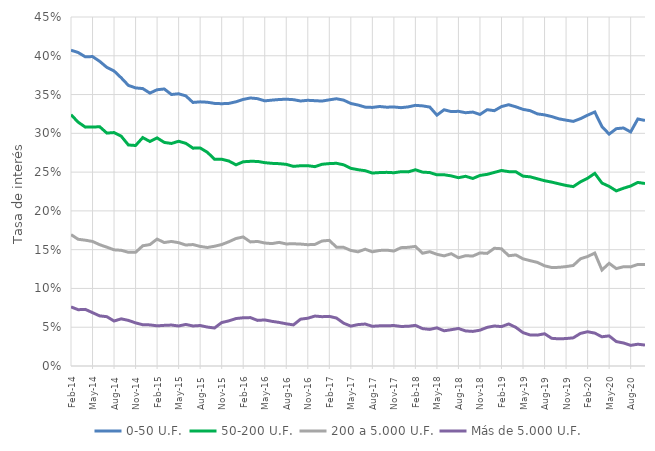
| Category | 0-50 U.F. | 50-200 U.F. | 200 a 5.000 U.F. | Más de 5.000 U.F. |
|---|---|---|---|---|
| 2014-02-01 | 0.407 | 0.324 | 0.169 | 0.076 |
| 2014-03-01 | 0.404 | 0.314 | 0.163 | 0.073 |
| 2014-04-01 | 0.399 | 0.308 | 0.162 | 0.073 |
| 2014-05-01 | 0.399 | 0.308 | 0.161 | 0.069 |
| 2014-06-01 | 0.393 | 0.308 | 0.156 | 0.065 |
| 2014-07-01 | 0.385 | 0.3 | 0.153 | 0.064 |
| 2014-08-01 | 0.38 | 0.301 | 0.15 | 0.058 |
| 2014-09-01 | 0.372 | 0.296 | 0.149 | 0.061 |
| 2014-10-01 | 0.362 | 0.285 | 0.147 | 0.059 |
| 2014-11-01 | 0.359 | 0.284 | 0.147 | 0.056 |
| 2014-12-01 | 0.358 | 0.294 | 0.155 | 0.053 |
| 2015-01-01 | 0.352 | 0.29 | 0.157 | 0.053 |
| 2015-02-01 | 0.356 | 0.294 | 0.164 | 0.052 |
| 2015-03-01 | 0.357 | 0.288 | 0.159 | 0.052 |
| 2015-04-01 | 0.35 | 0.287 | 0.161 | 0.053 |
| 2015-05-01 | 0.351 | 0.29 | 0.159 | 0.052 |
| 2015-06-01 | 0.348 | 0.287 | 0.156 | 0.054 |
| 2015-07-01 | 0.34 | 0.281 | 0.157 | 0.052 |
| 2015-08-01 | 0.341 | 0.281 | 0.154 | 0.052 |
| 2015-09-01 | 0.34 | 0.276 | 0.153 | 0.05 |
| 2015-10-01 | 0.339 | 0.267 | 0.154 | 0.049 |
| 2015-11-01 | 0.338 | 0.267 | 0.157 | 0.056 |
| 2015-12-01 | 0.339 | 0.264 | 0.16 | 0.058 |
| 2016-01-01 | 0.341 | 0.259 | 0.164 | 0.061 |
| 2016-02-01 | 0.344 | 0.263 | 0.166 | 0.062 |
| 2016-03-01 | 0.346 | 0.264 | 0.16 | 0.062 |
| 2016-04-01 | 0.345 | 0.264 | 0.161 | 0.059 |
| 2016-05-01 | 0.342 | 0.262 | 0.159 | 0.059 |
| 2016-06-01 | 0.343 | 0.261 | 0.158 | 0.058 |
| 2016-07-01 | 0.344 | 0.261 | 0.159 | 0.056 |
| 2016-08-01 | 0.344 | 0.26 | 0.157 | 0.054 |
| 2016-09-01 | 0.343 | 0.257 | 0.158 | 0.053 |
| 2016-10-01 | 0.342 | 0.258 | 0.157 | 0.06 |
| 2016-11-01 | 0.343 | 0.258 | 0.156 | 0.062 |
| 2016-12-01 | 0.342 | 0.257 | 0.157 | 0.064 |
| 2017-01-01 | 0.342 | 0.26 | 0.161 | 0.064 |
| 2017-02-01 | 0.343 | 0.261 | 0.162 | 0.064 |
| 2017-03-01 | 0.345 | 0.261 | 0.153 | 0.062 |
| 2017-04-01 | 0.343 | 0.259 | 0.153 | 0.055 |
| 2017-05-01 | 0.338 | 0.255 | 0.149 | 0.051 |
| 2017-06-01 | 0.336 | 0.253 | 0.147 | 0.053 |
| 2017-07-01 | 0.334 | 0.252 | 0.151 | 0.054 |
| 2017-08-01 | 0.333 | 0.249 | 0.147 | 0.051 |
| 2017-09-01 | 0.335 | 0.249 | 0.149 | 0.052 |
| 2017-10-01 | 0.334 | 0.25 | 0.149 | 0.052 |
| 2017-11-01 | 0.334 | 0.249 | 0.148 | 0.052 |
| 2017-12-01 | 0.333 | 0.25 | 0.153 | 0.051 |
| 2018-01-01 | 0.334 | 0.25 | 0.153 | 0.051 |
| 2018-02-01 | 0.336 | 0.253 | 0.154 | 0.052 |
| 2018-03-01 | 0.335 | 0.25 | 0.145 | 0.048 |
| 2018-04-01 | 0.334 | 0.249 | 0.147 | 0.047 |
| 2018-05-01 | 0.324 | 0.246 | 0.144 | 0.049 |
| 2018-06-01 | 0.33 | 0.247 | 0.142 | 0.045 |
| 2018-07-01 | 0.328 | 0.245 | 0.145 | 0.047 |
| 2018-08-01 | 0.328 | 0.243 | 0.14 | 0.048 |
| 2018-09-01 | 0.327 | 0.245 | 0.142 | 0.045 |
| 2018-10-01 | 0.327 | 0.242 | 0.142 | 0.045 |
| 2018-11-01 | 0.324 | 0.246 | 0.146 | 0.046 |
| 2018-12-01 | 0.33 | 0.247 | 0.145 | 0.05 |
| 2019-01-01 | 0.329 | 0.25 | 0.152 | 0.052 |
| 2019-02-01 | 0.334 | 0.252 | 0.151 | 0.051 |
| 2019-03-01 | 0.337 | 0.251 | 0.142 | 0.054 |
| 2019-04-01 | 0.334 | 0.25 | 0.143 | 0.05 |
| 2019-05-01 | 0.331 | 0.245 | 0.138 | 0.043 |
| 2019-06-01 | 0.329 | 0.244 | 0.136 | 0.04 |
| 2019-07-01 | 0.325 | 0.241 | 0.134 | 0.04 |
| 2019-08-01 | 0.324 | 0.239 | 0.129 | 0.042 |
| 2019-09-01 | 0.322 | 0.237 | 0.127 | 0.036 |
| 2019-10-01 | 0.319 | 0.235 | 0.127 | 0.035 |
| 2019-11-01 | 0.317 | 0.233 | 0.128 | 0.035 |
| 2019-12-01 | 0.315 | 0.231 | 0.13 | 0.036 |
| 2020-01-01 | 0.319 | 0.237 | 0.138 | 0.042 |
| 2020-02-01 | 0.323 | 0.242 | 0.141 | 0.044 |
| 2020-03-01 | 0.328 | 0.248 | 0.146 | 0.042 |
| 2020-04-01 | 0.309 | 0.236 | 0.124 | 0.038 |
| 2020-05-01 | 0.299 | 0.232 | 0.132 | 0.039 |
| 2020-06-01 | 0.306 | 0.226 | 0.126 | 0.032 |
| 2020-07-01 | 0.307 | 0.229 | 0.128 | 0.03 |
| 2020-08-01 | 0.302 | 0.232 | 0.128 | 0.027 |
| 2020-09-01 | 0.318 | 0.237 | 0.131 | 0.028 |
| 2020-10-01 | 0.317 | 0.235 | 0.131 | 0.027 |